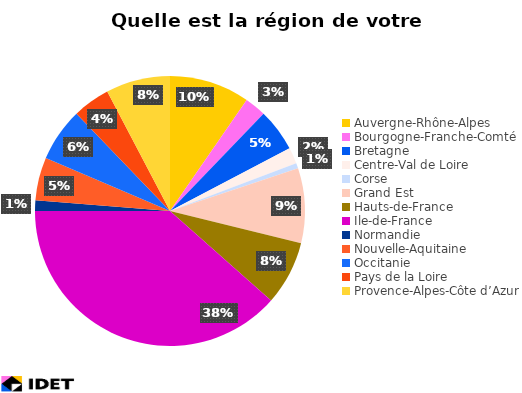
| Category | Series 1 |
|---|---|
| Auvergne-Rhône-Alpes | 15 |
| Bourgogne-Franche-Comté | 4 |
| Bretagne | 8 |
| Centre-Val de Loire | 3 |
| Corse | 1 |
| Grand Est | 14 |
| Hauts-de-France | 12 |
| Ile-de-France | 60 |
| Normandie | 2 |
| Nouvelle-Aquitaine | 8 |
| Occitanie | 10 |
| Pays de la Loire | 7 |
| Provence-Alpes-Côte d’Azur | 12 |